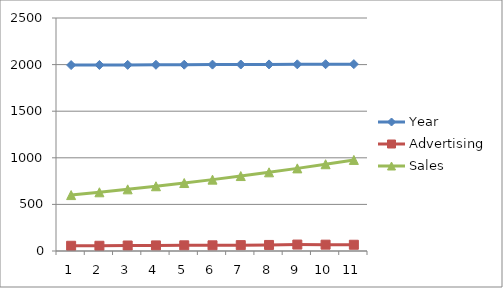
| Category | Year | Advertising | Sales |
|---|---|---|---|
| 0 | 1995 | 56 | 600 |
| 1 | 1996 | 56 | 630 |
| 2 | 1997 | 59 | 661.5 |
| 3 | 1998 | 60 | 694.575 |
| 4 | 1999 | 61 | 729.304 |
| 5 | 2000 | 61 | 765.769 |
| 6 | 2001 | 63 | 804.057 |
| 7 | 2002 | 65 | 844.26 |
| 8 | 2003 | 69 | 886.473 |
| 9 | 2004 | 68 | 930.797 |
| 10 | 2005 | 67 | 977.337 |